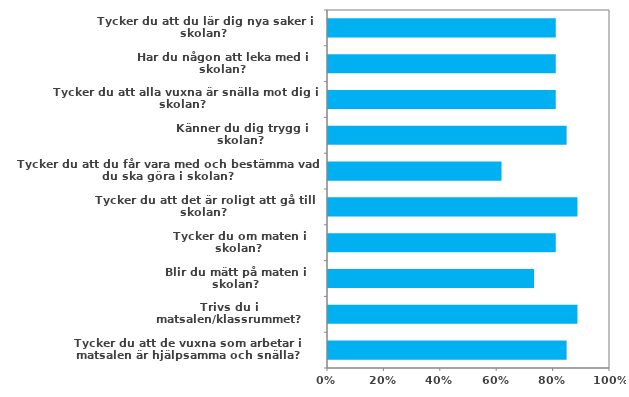
| Category | (Alla) |
|---|---|
| Tycker du att du lär dig nya saker i skolan? | 0.808 |
| Har du någon att leka med i skolan? | 0.808 |
| Tycker du att alla vuxna är snälla mot dig i skolan? | 0.808 |
| Känner du dig trygg i skolan? | 0.846 |
| Tycker du att du får vara med och bestämma vad du ska göra i skolan? | 0.615 |
| Tycker du att det är roligt att gå till skolan? | 0.885 |
| Tycker du om maten i skolan? | 0.808 |
| Blir du mätt på maten i skolan? | 0.731 |
| Trivs du i matsalen/klassrummet? | 0.885 |
| Tycker du att de vuxna som arbetar i matsalen är hjälpsamma och snälla? | 0.846 |